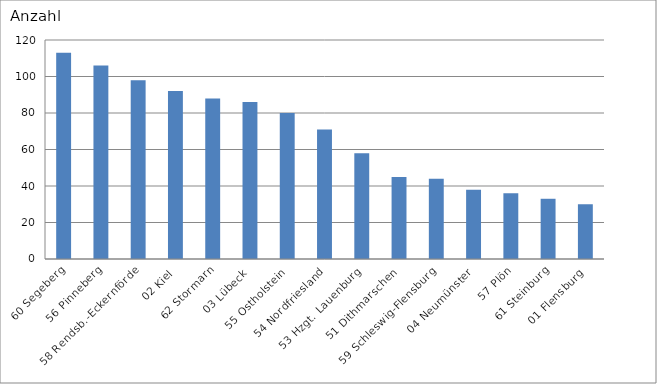
| Category | 60 Segeberg 56 Pinneberg 58 Rendsb.-Eckernförde 02 Kiel 62 Stormarn 03 Lübeck 55 Ostholstein 54 Nordfriesland 53 Hzgt. Lauenburg 51 Dithmarschen 59 Schleswig-Flensburg 04 Neumünster 57 Plön 61 Steinburg 01 Flensburg |
|---|---|
| 60 Segeberg | 113 |
| 56 Pinneberg | 106 |
| 58 Rendsb.-Eckernförde | 98 |
| 02 Kiel | 92 |
| 62 Stormarn | 88 |
| 03 Lübeck | 86 |
| 55 Ostholstein | 80 |
| 54 Nordfriesland | 71 |
| 53 Hzgt. Lauenburg | 58 |
| 51 Dithmarschen | 45 |
| 59 Schleswig-Flensburg | 44 |
| 04 Neumünster | 38 |
| 57 Plön | 36 |
| 61 Steinburg | 33 |
| 01 Flensburg | 30 |